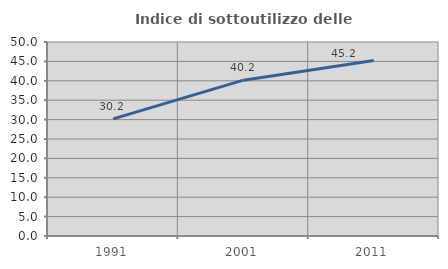
| Category | Indice di sottoutilizzo delle abitazioni  |
|---|---|
| 1991.0 | 30.189 |
| 2001.0 | 40.169 |
| 2011.0 | 45.243 |